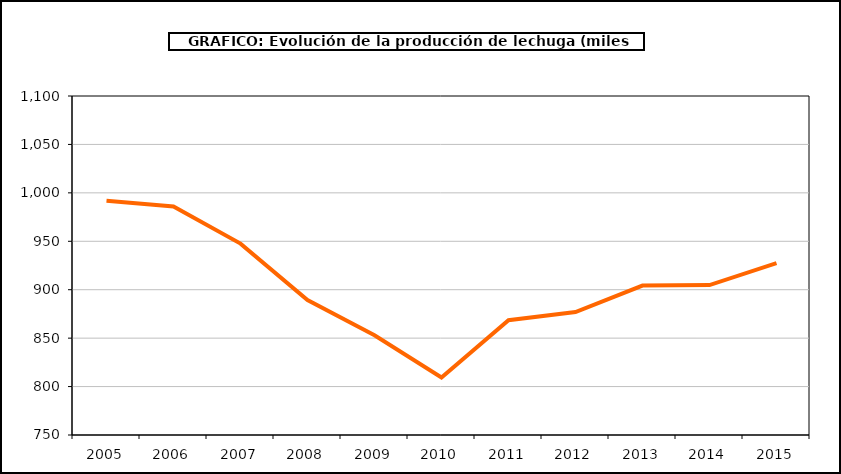
| Category | producción |
|---|---|
| 2005.0 | 991.873 |
| 2006.0 | 985.861 |
| 2007.0 | 947.612 |
| 2008.0 | 889.233 |
| 2009.0 | 852.988 |
| 2010.0 | 809.39 |
| 2011.0 | 868.436 |
| 2012.0 | 876.926 |
| 2013.0 | 904.283 |
| 2014.0 | 904.802 |
| 2015.0 | 927.378 |